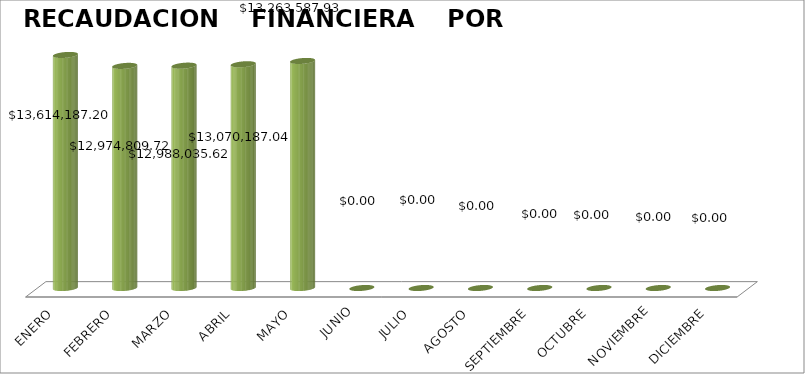
| Category | Series 0 |
|---|---|
| ENERO | 13614187.2 |
| FEBRERO | 12974809.72 |
| MARZO | 12988035.62 |
| ABRIL | 13070187.04 |
| MAYO | 13263587.93 |
| JUNIO | 0 |
| JULIO | 0 |
| AGOSTO | 0 |
| SEPTIEMBRE | 0 |
| OCTUBRE | 0 |
| NOVIEMBRE | 0 |
| DICIEMBRE | 0 |